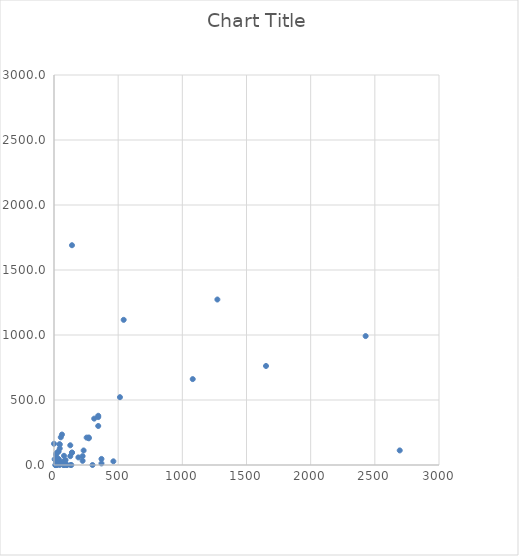
| Category | Series 0 |
|---|---|
| 313.20934912997456 | 356.65 |
| 223.0078965498704 | 68.172 |
| 223.0078965498704 | 32.196 |
| 190.0 | 58.439 |
| 73.59425509384508 | 0 |
| 24.865479056620696 | 2.911 |
| 44.74826195239492 | 0 |
| 44.74826195239492 | 127.273 |
| 81.58608887873795 | 0 |
| 2694.0 | 112.111 |
| 62.092122555256076 | 234.308 |
| 38.4 | 40.561 |
| 77.99080221535269 | 70.732 |
| 77.99080221535269 | 0.926 |
| 43.7761242869461 | 158.709 |
| 43.7761242869461 | 158.709 |
| 254.42171820036003 | 210.739 |
| 0.0 | 163.458 |
| 5.0 | 44.071 |
| 230.8822457432807 | 111.653 |
| 270.99599651149765 | 211.497 |
| 270.99599651149765 | 205.377 |
| 344.6591490283299 | 368.59 |
| 344.6591490283299 | 300.17 |
| 543.0 | 1116.585 |
| 344.6591490283299 | 378.64 |
| 18.0 | 29.045 |
| 52.94202794271511 | 15.855 |
| 52.94202794271511 | 213.214 |
| 462.74357720421176 | 28.25 |
| 77.87629309059868 | 29.604 |
| 77.87629309059868 | 0 |
| 90.0 | 37.467 |
| 129.0 | 0 |
| 1652.0 | 761.663 |
| 1273.0 | 1273 |
| 2428.4 | 991.739 |
| 1081.0 | 660.779 |
| 18.033714267663758 | 18.497 |
| 18.033714267663758 | 90.081 |
| 126.84371246099151 | 67.821 |
| 126.84371246099151 | 151.651 |
| 369.9426782966039 | 46.661 |
| 19.645 | 6.793 |
| 369.94267829660396 | 12.014 |
| 33.2866132374386 | 14.47 |
| 33.2866132374386 | 9.738 |
| 33.2866132374386 | 10.29 |
| 33.54609193947576 | 48.33 |
| 33.54609193947576 | 41.224 |
| 34.0 | 102.833 |
| 34.0 | 102.833 |
| 50.577597299635535 | 20.697 |
| 514.0 | 521.637 |
| 10.0 | 0 |
| 140.1 | 95.047 |
| 140.1 | 95.047 |
| 140.1 | 1690.551 |
| 16.247085350905063 | 6.768 |
| 16.247085350905063 | 2.053 |
| 16.247085350905063 | 5.837 |
| 16.247085350905063 | 0 |
| 16.247085350905063 | 0 |
| 300.0 | 0 |
| 16.247085350905063 | 2.192 |
| 16.247085350905063 | 53.116 |
| 16.247085350905063 | 77.886 |
| 16.247085350905063 | 0.272 |
| 16.247085350905063 | 0 |
| 101.0 | 0 |
| 100.0 | 0 |
| 135.0 | 0 |